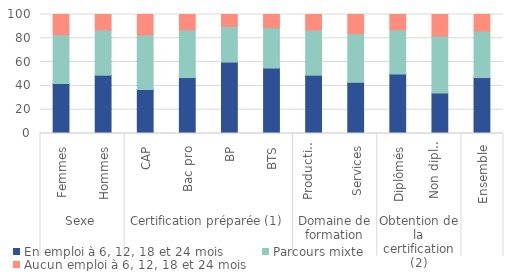
| Category | En emploi à 6, 12, 18 et 24 mois | Parcours mixte | Aucun emploi à 6, 12, 18 et 24 mois |
|---|---|---|---|
| 0 | 42 | 41 | 17 |
| 1 | 49 | 38 | 13 |
| 2 | 37 | 46 | 17 |
| 3 | 47 | 40 | 13 |
| 4 | 60 | 30 | 10 |
| 5 | 55 | 34 | 11 |
| 6 | 49 | 38 | 13 |
| 7 | 43 | 41 | 16 |
| 8 | 50 | 37 | 13 |
| 9 | 34 | 48 | 18 |
| 10 | 47 | 39 | 14 |